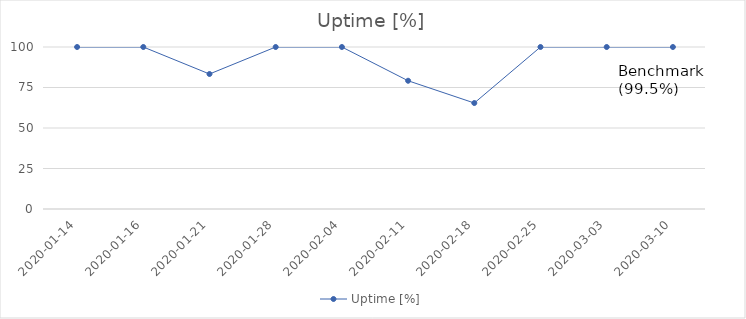
| Category | Uptime [%] |
|---|---|
| 2020-01-14 | 100 |
| 2020-01-16 | 100 |
| 2020-01-21 | 83.333 |
| 2020-01-28 | 100 |
| 2020-02-04 | 100 |
| 2020-02-11 | 79.167 |
| 2020-02-18 | 65.417 |
| 2020-02-25 | 100 |
| 2020-03-03 | 100 |
| 2020-03-10 | 100 |